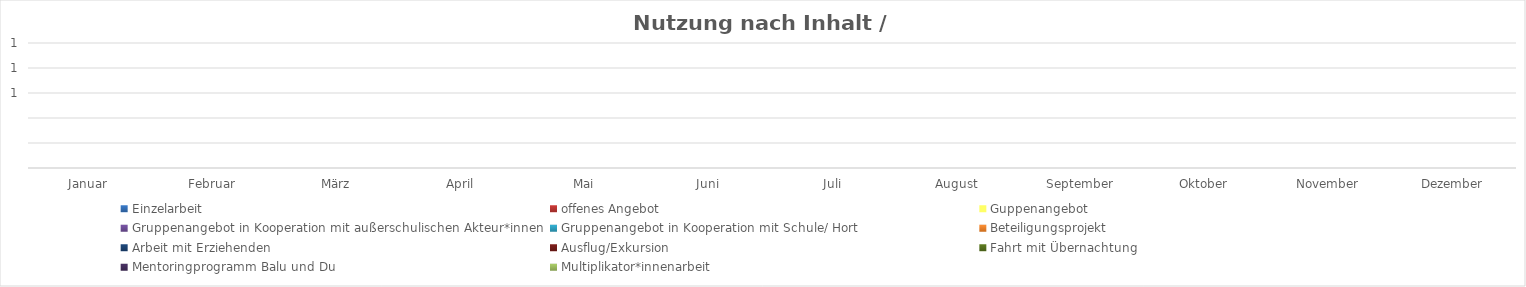
| Category | Einzelarbeit | offenes Angebot | Guppenangebot | Gruppenangebot in Kooperation mit außerschulischen Akteur*innen | Gruppenangebot in Kooperation mit Schule/ Hort | Beteiligungsprojekt | Arbeit mit Erziehenden | Ausflug/Exkursion | Fahrt mit Übernachtung | Mentoringprogramm Balu und Du | Multiplikator*innenarbeit |
|---|---|---|---|---|---|---|---|---|---|---|---|
| Januar | 0 | 0 | 0 | 0 | 0 | 0 | 0 | 0 | 0 | 0 | 0 |
| Februar | 0 | 0 | 0 | 0 | 0 | 0 | 0 | 0 | 0 | 0 | 0 |
| März | 0 | 0 | 0 | 0 | 0 | 0 | 0 | 0 | 0 | 0 | 0 |
| April | 0 | 0 | 0 | 0 | 0 | 0 | 0 | 0 | 0 | 0 | 0 |
| Mai | 0 | 0 | 0 | 0 | 0 | 0 | 0 | 0 | 0 | 0 | 0 |
| Juni | 0 | 0 | 0 | 0 | 0 | 0 | 0 | 0 | 0 | 0 | 0 |
| Juli | 0 | 0 | 0 | 0 | 0 | 0 | 0 | 0 | 0 | 0 | 0 |
| August | 0 | 0 | 0 | 0 | 0 | 0 | 0 | 0 | 0 | 0 | 0 |
| September | 0 | 0 | 0 | 0 | 0 | 0 | 0 | 0 | 0 | 0 | 0 |
| Oktober | 0 | 0 | 0 | 0 | 0 | 0 | 0 | 0 | 0 | 0 | 0 |
| November | 0 | 0 | 0 | 0 | 0 | 0 | 0 | 0 | 0 | 0 | 0 |
| Dezember | 0 | 0 | 0 | 0 | 0 | 0 | 0 | 0 | 0 | 0 | 0 |